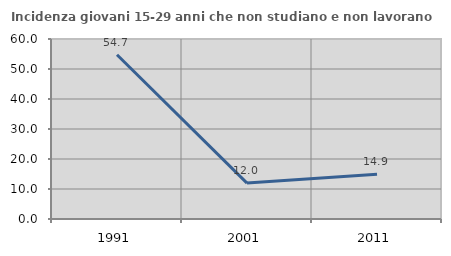
| Category | Incidenza giovani 15-29 anni che non studiano e non lavorano  |
|---|---|
| 1991.0 | 54.739 |
| 2001.0 | 11.969 |
| 2011.0 | 14.911 |